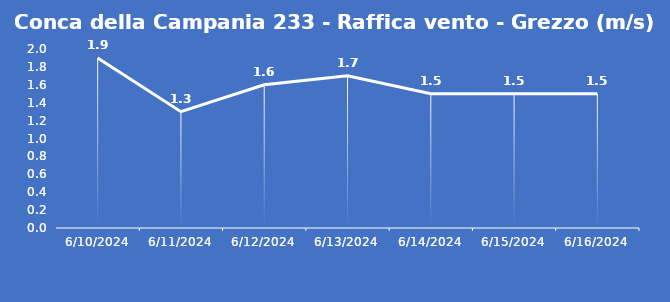
| Category | Conca della Campania 233 - Raffica vento - Grezzo (m/s) |
|---|---|
| 6/10/24 | 1.9 |
| 6/11/24 | 1.3 |
| 6/12/24 | 1.6 |
| 6/13/24 | 1.7 |
| 6/14/24 | 1.5 |
| 6/15/24 | 1.5 |
| 6/16/24 | 1.5 |